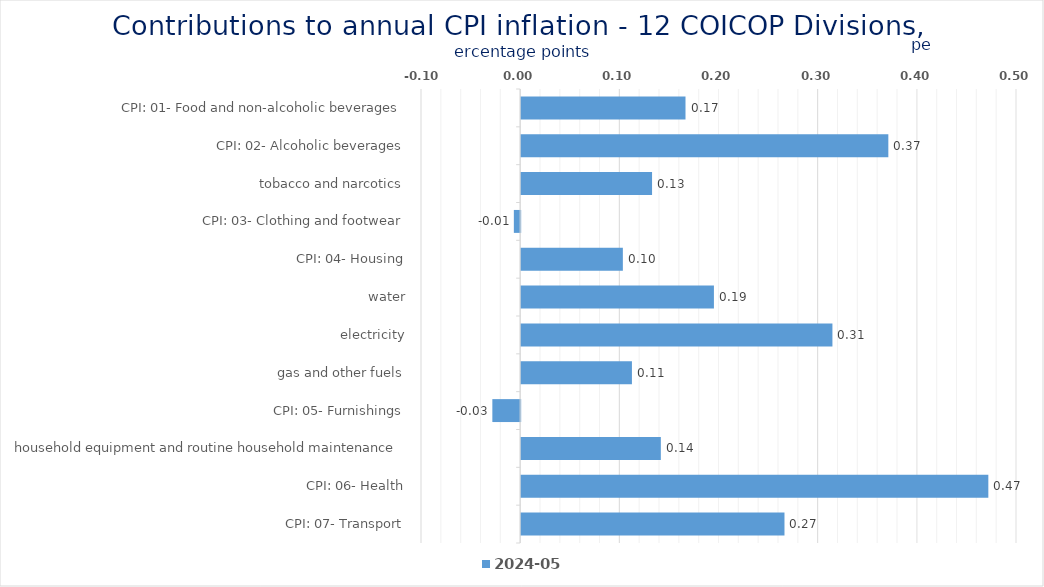
| Category | 2024-05 |
|---|---|
| CPI: 01- Food and non-alcoholic beverages | 0.166 |
| CPI: 02- Alcoholic beverages, tobacco and narcotics | 0.37 |
| CPI: 03- Clothing and footwear | 0.132 |
| CPI: 04- Housing, water, electricity, gas and other fuels | -0.006 |
| CPI: 05- Furnishings, household equipment and routine household maintenance | 0.103 |
| CPI: 06- Health | 0.194 |
| CPI: 07- Transport | 0.314 |
| CPI: 08- Communication | 0.112 |
| CPI: 09- Recreation and culture | -0.028 |
| CPI: 10- Education | 0.141 |
| CPI: 11- Restaurants and hotels | 0.471 |
| CPI: 12- Miscellaneous goods and services | 0.266 |